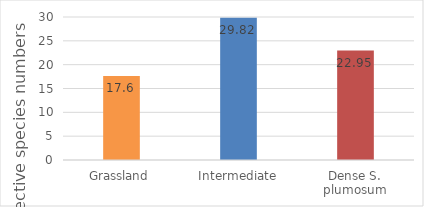
| Category | Effective numbers |
|---|---|
| Grassland | 17.6 |
| Intermediate | 29.82 |
| Dense S. plumosum | 22.95 |